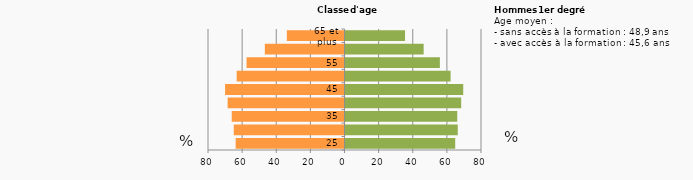
| Category | Femmes | Hommes |
|---|---|---|
| 25 | -63.8 | 64.3 |
| 30 | -64.9 | 65.8 |
| 35 | -66.1 | 65.5 |
| 40 | -68.5 | 67.8 |
| 45 | -70 | 69 |
| 50 | -63.2 | 61.6 |
| 55 | -57.4 | 55.3 |
| 60 | -46.7 | 45.8 |
| 65 et plus | -33.8 | 34.9 |